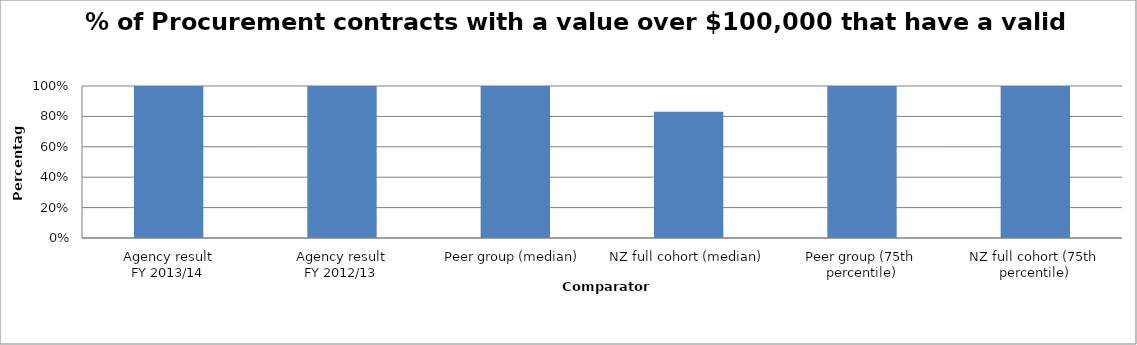
| Category | Series 0 |
|---|---|
| Agency result
FY 2013/14 | 1 |
| Agency result
FY 2012/13 | 1 |
| Peer group (median) | 1 |
| NZ full cohort (median) | 0.83 |
| Peer group (75th percentile) | 1 |
| NZ full cohort (75th percentile) | 1 |